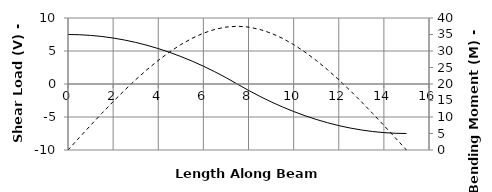
| Category | V |
|---|---|
| 0.0 | 7.5 |
| 0.0 | 7.5 |
| 1e-05 | 7.5 |
| 0.5 | 7.467 |
| 1.0 | 7.367 |
| 1.5 | 7.2 |
| 2.0 | 6.967 |
| 2.00001 | 6.967 |
| 2.5 | 6.667 |
| 3.0 | 6.3 |
| 3.5 | 5.867 |
| 4.0 | 5.367 |
| 4.5 | 4.8 |
| 5.0 | 4.167 |
| 5.5 | 3.467 |
| 6.0 | 2.7 |
| 6.5 | 1.867 |
| 7.0 | 0.967 |
| 7.5 | 0 |
| 8.0 | -0.967 |
| 8.5 | -1.867 |
| 9.0 | -2.7 |
| 9.5 | -3.467 |
| 10.0 | -4.167 |
| 10.5 | -4.8 |
| 11.0 | -5.367 |
| 11.5 | -5.867 |
| 12.0 | -6.3 |
| 12.5 | -6.667 |
| 13.0 | -6.967 |
| 13.5 | -7.2 |
| 14.0 | -7.367 |
| 14.5 | -7.467 |
| 15.0 | -7.5 |